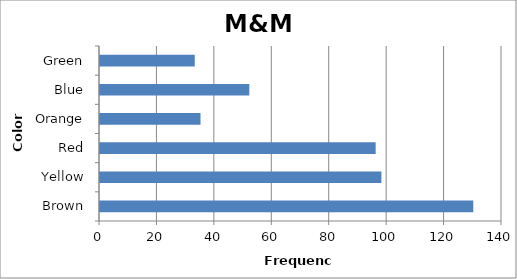
| Category | M&M Color |
|---|---|
| Brown | 130 |
| Yellow | 98 |
| Red | 96 |
| Orange | 35 |
| Blue | 52 |
| Green | 33 |